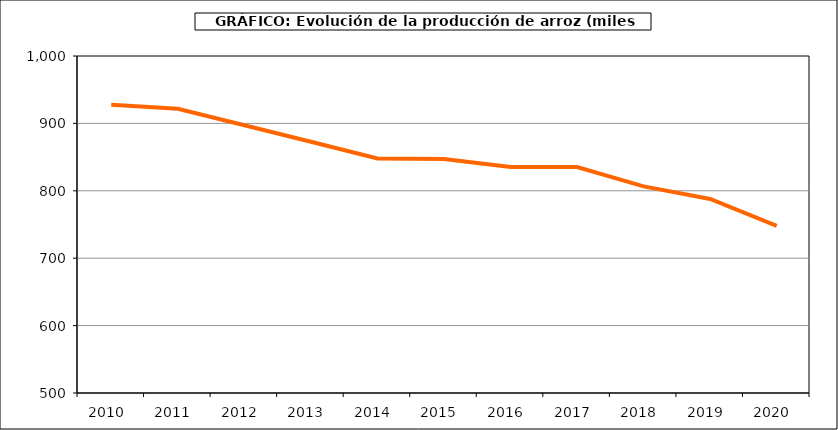
| Category | Superficie |
|---|---|
| 2010.0 | 927.817 |
| 2011.0 | 921.738 |
| 2012.0 | 897.318 |
| 2013.0 | 872.689 |
| 2014.0 | 847.976 |
| 2015.0 | 847.026 |
| 2016.0 | 835.2 |
| 2017.0 | 835.178 |
| 2018.0 | 806.589 |
| 2019.0 | 787.832 |
| 2020.0 | 747.828 |